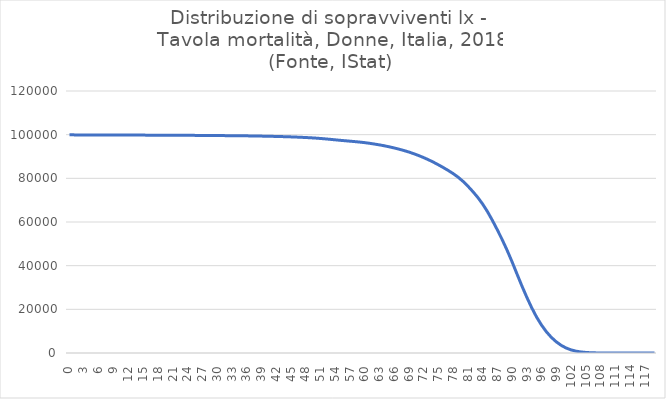
| Category | lx |
|---|---|
| 0.0 | 100000 |
| 1.0 | 99899 |
| 2.0 | 99891 |
| 3.0 | 99883 |
| 4.0 | 99875 |
| 5.0 | 99867 |
| 6.0 | 99859 |
| 7.0 | 99852 |
| 8.0 | 99844 |
| 9.0 | 99837 |
| 10.0 | 99829 |
| 11.0 | 99822 |
| 12.0 | 99814 |
| 13.0 | 99807 |
| 14.0 | 99799 |
| 15.0 | 99792 |
| 16.0 | 99784 |
| 17.0 | 99777 |
| 18.0 | 99769 |
| 19.0 | 99761 |
| 20.0 | 99752 |
| 21.0 | 99740 |
| 22.0 | 99728 |
| 23.0 | 99714 |
| 24.0 | 99699 |
| 25.0 | 99683 |
| 26.0 | 99666 |
| 27.0 | 99648 |
| 28.0 | 99628 |
| 29.0 | 99609 |
| 30.0 | 99589 |
| 31.0 | 99571 |
| 32.0 | 99553 |
| 33.0 | 99535 |
| 34.0 | 99515 |
| 35.0 | 99491 |
| 36.0 | 99459 |
| 37.0 | 99424 |
| 38.0 | 99385 |
| 39.0 | 99341 |
| 40.0 | 99293 |
| 41.0 | 99243 |
| 42.0 | 99189 |
| 43.0 | 99131 |
| 44.0 | 99066 |
| 45.0 | 98991 |
| 46.0 | 98904 |
| 47.0 | 98808 |
| 48.0 | 98700 |
| 49.0 | 98579 |
| 50.0 | 98438 |
| 51.0 | 98268 |
| 52.0 | 98078 |
| 53.0 | 97869 |
| 54.0 | 97648 |
| 55.0 | 97425 |
| 56.0 | 97229 |
| 57.0 | 97030 |
| 58.0 | 96830 |
| 59.0 | 96613 |
| 60.0 | 96363 |
| 61.0 | 96058 |
| 62.0 | 95718 |
| 63.0 | 95344 |
| 64.0 | 94927 |
| 65.0 | 94458 |
| 66.0 | 93941 |
| 67.0 | 93373 |
| 68.0 | 92757 |
| 69.0 | 92074 |
| 70.0 | 91310 |
| 71.0 | 90460 |
| 72.0 | 89532 |
| 73.0 | 88528 |
| 74.0 | 87433 |
| 75.0 | 86231 |
| 76.0 | 84987 |
| 77.0 | 83650 |
| 78.0 | 82224 |
| 79.0 | 80608 |
| 80.0 | 78708 |
| 81.0 | 76502 |
| 82.0 | 74053 |
| 83.0 | 71388 |
| 84.0 | 68351 |
| 85.0 | 64822 |
| 86.0 | 60823 |
| 87.0 | 56509 |
| 88.0 | 51979 |
| 89.0 | 47117 |
| 90.0 | 41884 |
| 91.0 | 36317 |
| 92.0 | 30834 |
| 93.0 | 25624 |
| 94.0 | 20809 |
| 95.0 | 16487 |
| 96.0 | 12826 |
| 97.0 | 9729 |
| 98.0 | 7192 |
| 99.0 | 5143 |
| 100.0 | 3530 |
| 101.0 | 2308 |
| 102.0 | 1442 |
| 103.0 | 859 |
| 104.0 | 485 |
| 105.0 | 258 |
| 106.0 | 128 |
| 107.0 | 59 |
| 108.0 | 26 |
| 109.0 | 10 |
| 110.0 | 4 |
| 111.0 | 1 |
| 112.0 | 0 |
| 113.0 | 0 |
| 114.0 | 0 |
| 115.0 | 0 |
| 116.0 | 0 |
| 117.0 | 0 |
| 118.0 | 0 |
| 119.0 | 0 |